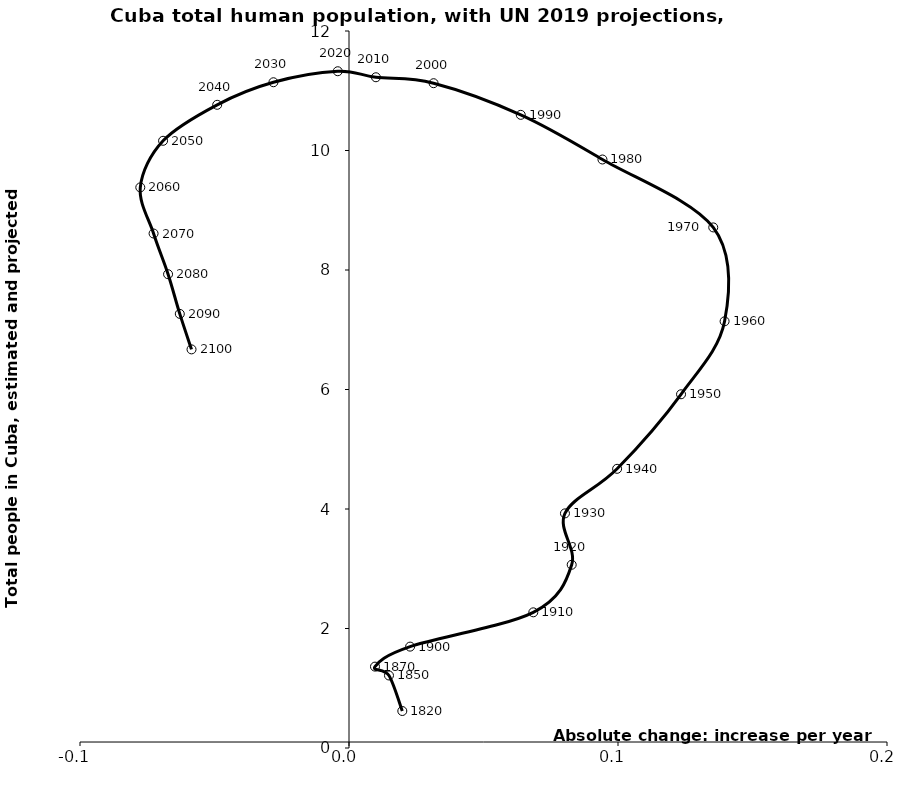
| Category | Series 0 |
|---|---|
| 0.019818587917026776 | 0.619 |
| 0.01485882426274848 | 1.214 |
| 0.009660282440795153 | 1.362 |
| 0.022718037095937747 | 1.697 |
| 0.06851227853932582 | 2.271 |
| 0.08278780184961101 | 3.067 |
| 0.08028063108902328 | 3.927 |
| 0.09967282942091611 | 4.673 |
| 0.12343511851339706 | 5.92 |
| 0.13962740000000018 | 7.141 |
| 0.13541045000000004 | 8.713 |
| 0.09422229999999994 | 9.849 |
| 0.06384854999999963 | 10.597 |
| 0.03144225000000027 | 11.126 |
| 0.010009300000000021 | 11.226 |
| -0.004175200000000334 | 11.327 |
| -0.028093099999999982 | 11.142 |
| -0.048996599999999814 | 10.765 |
| -0.06911440000000013 | 10.162 |
| -0.07758590000000005 | 9.382 |
| -0.07264984999999968 | 8.611 |
| -0.06725980000000006 | 7.929 |
| -0.06290024999999991 | 7.265 |
| -0.05854069999999975 | 6.671 |